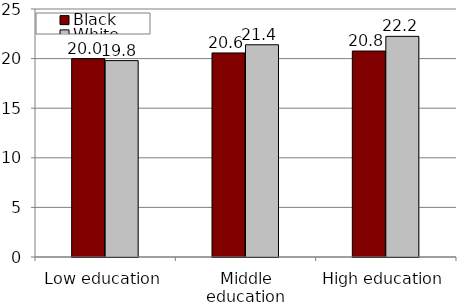
| Category | Black | White |
|---|---|---|
| Low education | 19.998 | 19.797 |
| Middle education | 20.57 | 21.394 |
| High education | 20.762 | 22.243 |